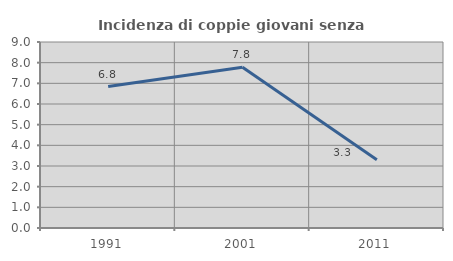
| Category | Incidenza di coppie giovani senza figli |
|---|---|
| 1991.0 | 6.842 |
| 2001.0 | 7.78 |
| 2011.0 | 3.299 |